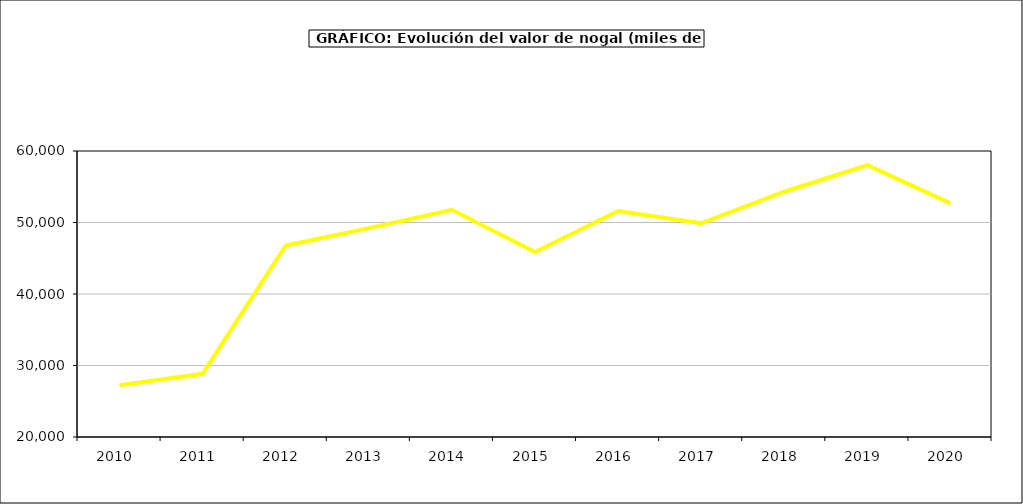
| Category | valor nogal |
|---|---|
| 2010.0 | 27232.257 |
| 2011.0 | 28841.576 |
| 2012.0 | 46777.981 |
| 2013.0 | 49217.301 |
| 2014.0 | 51776.04 |
| 2015.0 | 45857 |
| 2016.0 | 51595 |
| 2017.0 | 49891.162 |
| 2018.0 | 54304.281 |
| 2019.0 | 58028.936 |
| 2020.0 | 52678.304 |